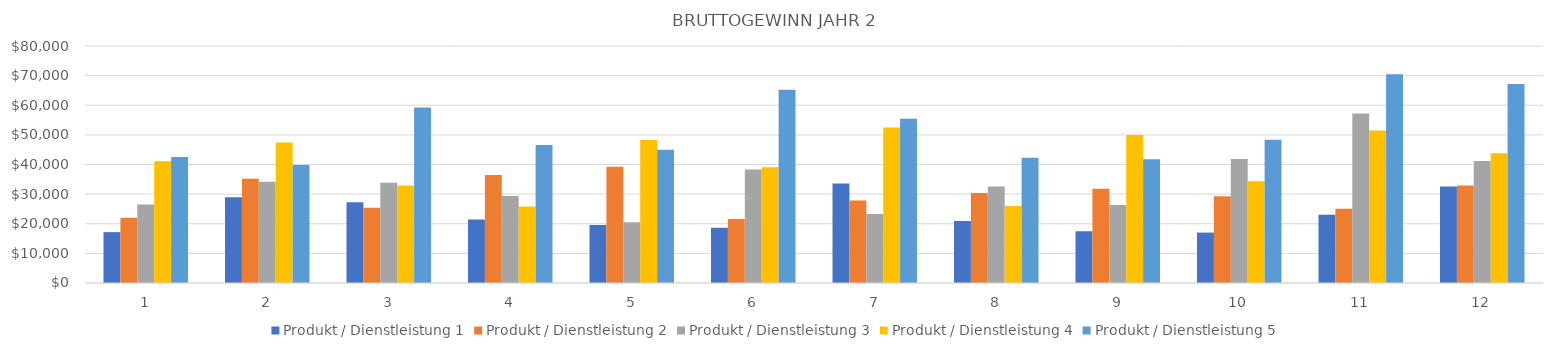
| Category | Produkt / Dienstleistung 1 | Produkt / Dienstleistung 2 | Produkt / Dienstleistung 3 | Produkt / Dienstleistung 4 | Produkt / Dienstleistung 5 |
|---|---|---|---|---|---|
| 0 | 17167.8 | 21992.6 | 26467 | 41126.4 | 42546 |
| 1 | 28975.1 | 35202.65 | 34178.4 | 47385.9 | 39830 |
| 2 | 27264 | 25397.75 | 33852 | 32945 | 59276 |
| 3 | 21413.6 | 36433.8 | 29356.6 | 25861.5 | 46578 |
| 4 | 19574.7 | 39261.6 | 20536 | 48289.5 | 45010 |
| 5 | 18637.5 | 21563.4 | 38322 | 39049.5 | 65212 |
| 6 | 33575.9 | 27828.85 | 23328 | 52448 | 55468 |
| 7 | 20959.2 | 30360 | 32580 | 26026 | 42238 |
| 8 | 17437.6 | 31848 | 26289 | 49962 | 41748 |
| 9 | 17017 | 29310.05 | 41841 | 34386 | 48356 |
| 10 | 23032.1 | 25074.75 | 57220.9 | 51454 | 70490 |
| 11 | 32578 | 32910 | 41140 | 43836 | 67192 |